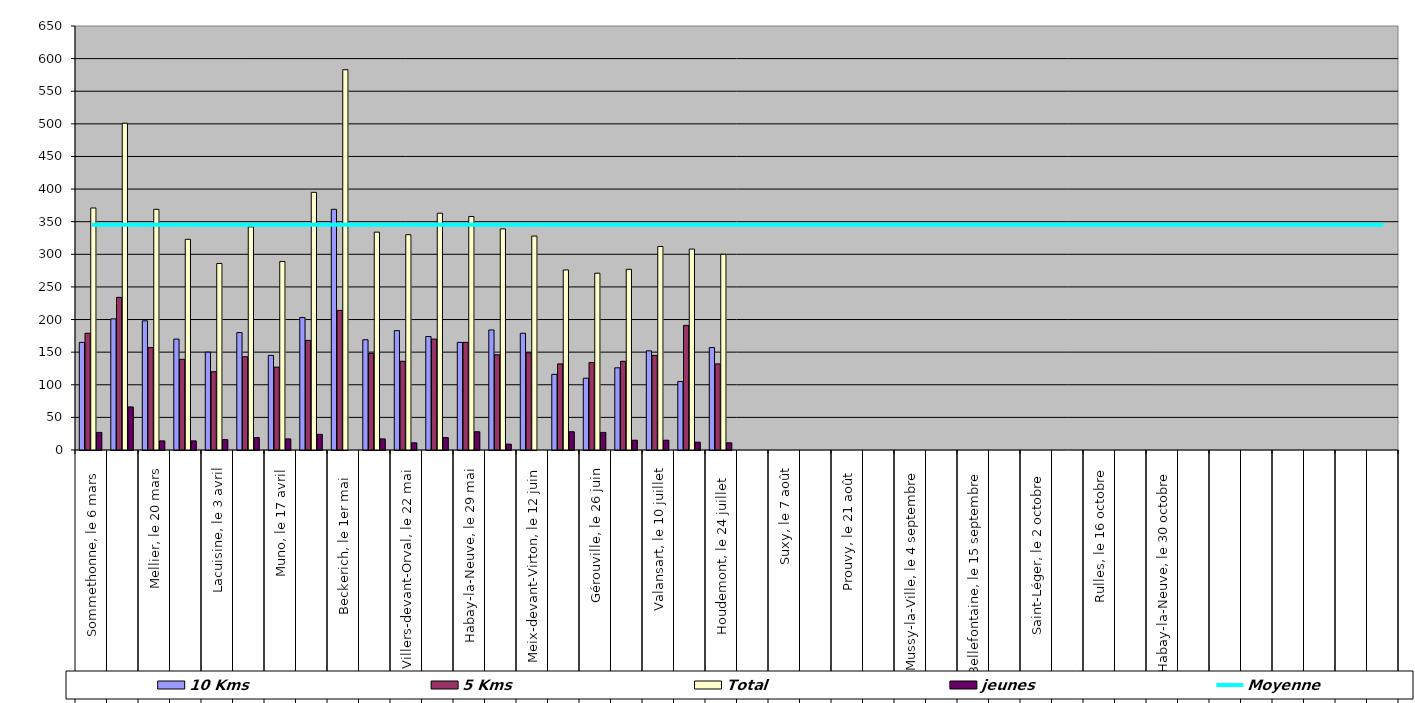
| Category | 10 Kms | 5 Kms | Total | jeunes |
|---|---|---|---|---|
| 0 | 165 | 179 | 371 | 27 |
| 1 | 201 | 234 | 501 | 66 |
| 2 | 198 | 157 | 369 | 14 |
| 3 | 170 | 139 | 323 | 14 |
| 4 | 150 | 120 | 286 | 16 |
| 5 | 180 | 143 | 342 | 19 |
| 6 | 145 | 127 | 289 | 17 |
| 7 | 203 | 168 | 395 | 24 |
| 8 | 369 | 214 | 583 | 0 |
| 9 | 169 | 148 | 334 | 17 |
| 10 | 183 | 136 | 330 | 11 |
| 11 | 174 | 170 | 363 | 19 |
| 12 | 165 | 165 | 358 | 28 |
| 13 | 184 | 146 | 339 | 9 |
| 14 | 179 | 149 | 328 | 0 |
| 15 | 116 | 132 | 276 | 28 |
| 16 | 110 | 134 | 271 | 27 |
| 17 | 126 | 136 | 277 | 15 |
| 18 | 152 | 145 | 312 | 15 |
| 19 | 105 | 191 | 308 | 12 |
| 20 | 157 | 132 | 300 | 11 |
| 21 | 0 | 0 | 0 | 0 |
| 22 | 0 | 0 | 0 | 0 |
| 23 | 0 | 0 | 0 | 0 |
| 24 | 0 | 0 | 0 | 0 |
| 25 | 0 | 0 | 0 | 0 |
| 26 | 0 | 0 | 0 | 0 |
| 27 | 0 | 0 | 0 | 0 |
| 28 | 0 | 0 | 0 | 0 |
| 29 | 0 | 0 | 0 | 0 |
| 30 | 0 | 0 | 0 | 0 |
| 31 | 0 | 0 | 0 | 0 |
| 32 | 0 | 0 | 0 | 0 |
| 33 | 0 | 0 | 0 | 0 |
| 34 | 0 | 0 | 0 | 0 |
| 35 | 0 | 0 | 0 | 0 |
| 36 | 0 | 0 | 0 | 0 |
| 37 | 0 | 0 | 0 | 0 |
| 38 | 0 | 0 | 0 | 0 |
| 39 | 0 | 0 | 0 | 0 |
| 40 | 0 | 0 | 0 | 0 |
| 41 | 0 | 0 | 0 | 0 |